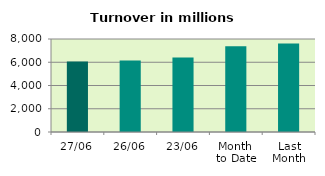
| Category | Series 0 |
|---|---|
| 27/06 | 6073.086 |
| 26/06 | 6159.536 |
| 23/06 | 6405.367 |
| Month 
to Date | 7380.495 |
| Last
Month | 7604.877 |